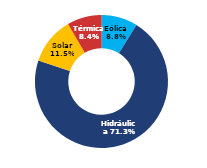
| Category | Sur |
|---|---|
| Eólica | 48.748 |
| Hidráulica | 394.574 |
| Solar | 63.768 |
| Térmica | 46.395 |